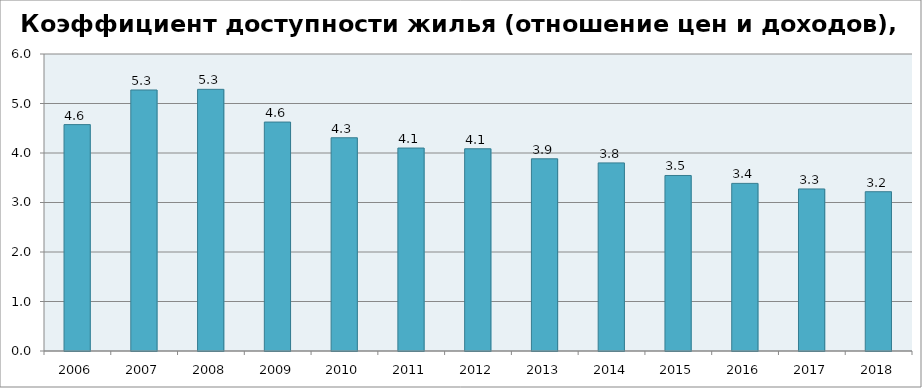
| Category | Series 0 |
|---|---|
| 2006.0 | 4.574 |
| 2007.0 | 5.273 |
| 2008.0 | 5.286 |
| 2009.0 | 4.625 |
| 2010.0 | 4.308 |
| 2011.0 | 4.1 |
| 2012.0 | 4.085 |
| 2013.0 | 3.883 |
| 2014.0 | 3.8 |
| 2015.0 | 3.546 |
| 2016.0 | 3.386 |
| 2017.0 | 3.274 |
| 2018.0 | 3.218 |